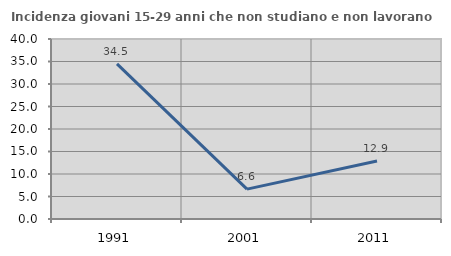
| Category | Incidenza giovani 15-29 anni che non studiano e non lavorano  |
|---|---|
| 1991.0 | 34.483 |
| 2001.0 | 6.637 |
| 2011.0 | 12.883 |